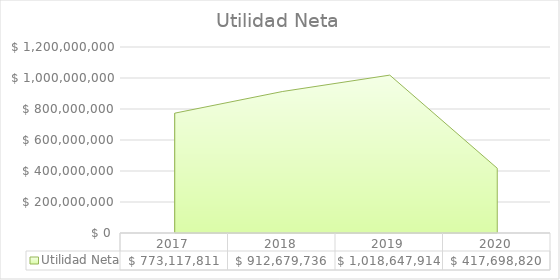
| Category | Utilidad Neta |
|---|---|
| 2017.0 | 773117811.451 |
| 2018.0 | 912679736.034 |
| 2019.0 | 1018647913.8 |
| 2020.0 | 417698820 |